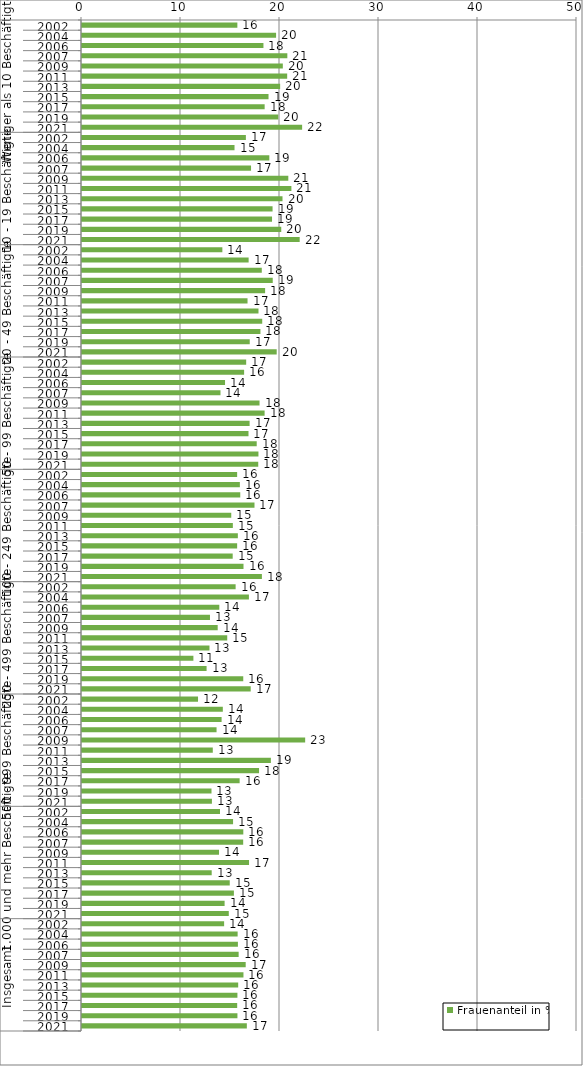
| Category | Frauenanteil in % |
|---|---|
| 0 | 15.693 |
| 1 | 19.605 |
| 2 | 18.327 |
| 3 | 20.741 |
| 4 | 20.286 |
| 5 | 20.725 |
| 6 | 20.015 |
| 7 | 18.841 |
| 8 | 18.449 |
| 9 | 19.826 |
| 10 | 22.235 |
| 11 | 16.554 |
| 12 | 15.406 |
| 13 | 18.923 |
| 14 | 17.075 |
| 15 | 20.839 |
| 16 | 21.151 |
| 17 | 20.254 |
| 18 | 19.249 |
| 19 | 19.196 |
| 20 | 20.126 |
| 21 | 21.989 |
| 22 | 14.178 |
| 23 | 16.832 |
| 24 | 18.161 |
| 25 | 19.266 |
| 26 | 18.497 |
| 27 | 16.72 |
| 28 | 17.827 |
| 29 | 18.205 |
| 30 | 18.023 |
| 31 | 16.944 |
| 32 | 19.667 |
| 33 | 16.584 |
| 34 | 16.376 |
| 35 | 14.448 |
| 36 | 13.988 |
| 37 | 17.933 |
| 38 | 18.446 |
| 39 | 16.93 |
| 40 | 16.818 |
| 41 | 17.648 |
| 42 | 17.823 |
| 43 | 17.803 |
| 44 | 15.671 |
| 45 | 15.946 |
| 46 | 15.986 |
| 47 | 17.423 |
| 48 | 15.077 |
| 49 | 15.238 |
| 50 | 15.742 |
| 51 | 15.671 |
| 52 | 15.222 |
| 53 | 16.314 |
| 54 | 18.171 |
| 55 | 15.518 |
| 56 | 16.86 |
| 57 | 13.87 |
| 58 | 12.927 |
| 59 | 13.707 |
| 60 | 14.67 |
| 61 | 12.877 |
| 62 | 11.252 |
| 63 | 12.584 |
| 64 | 16.288 |
| 65 | 17.041 |
| 66 | 11.72 |
| 67 | 14.225 |
| 68 | 14.101 |
| 69 | 13.591 |
| 70 | 22.542 |
| 71 | 13.211 |
| 72 | 19.079 |
| 73 | 17.884 |
| 74 | 15.923 |
| 75 | 13.08 |
| 76 | 13.123 |
| 77 | 13.94 |
| 78 | 15.259 |
| 79 | 16.294 |
| 80 | 16.282 |
| 81 | 13.841 |
| 82 | 16.873 |
| 83 | 13.101 |
| 84 | 14.925 |
| 85 | 15.342 |
| 86 | 14.405 |
| 87 | 14.827 |
| 88 | 14.356 |
| 89 | 15.721 |
| 90 | 15.748 |
| 91 | 15.822 |
| 92 | 16.535 |
| 93 | 16.31 |
| 94 | 15.777 |
| 95 | 15.699 |
| 96 | 15.675 |
| 97 | 15.7 |
| 98 | 16.65 |